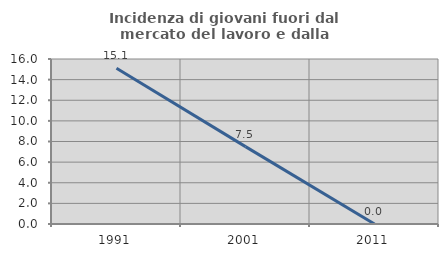
| Category | Incidenza di giovani fuori dal mercato del lavoro e dalla formazione  |
|---|---|
| 1991.0 | 15.094 |
| 2001.0 | 7.5 |
| 2011.0 | 0 |